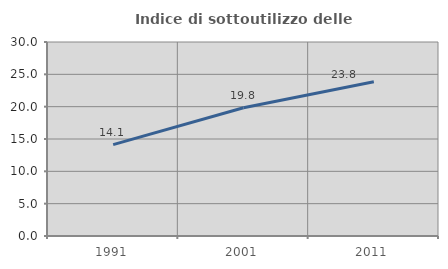
| Category | Indice di sottoutilizzo delle abitazioni  |
|---|---|
| 1991.0 | 14.127 |
| 2001.0 | 19.835 |
| 2011.0 | 23.84 |